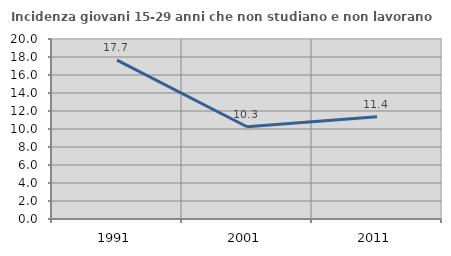
| Category | Incidenza giovani 15-29 anni che non studiano e non lavorano  |
|---|---|
| 1991.0 | 17.652 |
| 2001.0 | 10.252 |
| 2011.0 | 11.371 |